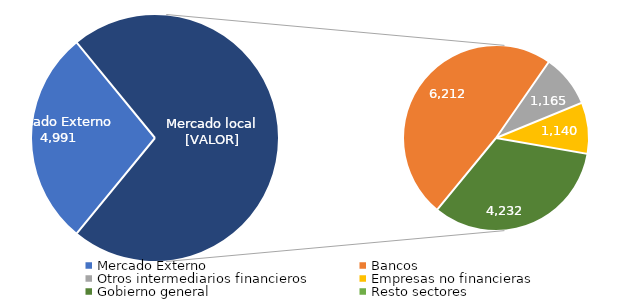
| Category | Series 0 |
|---|---|
| Mercado Externo | 4991.142 |
| Bancos | 6212.296 |
| Otros intermediarios financieros | 1164.57 |
| Empresas no financieras | 1139.958 |
| Gobierno general | 4232.076 |
| Resto sectores | 0 |